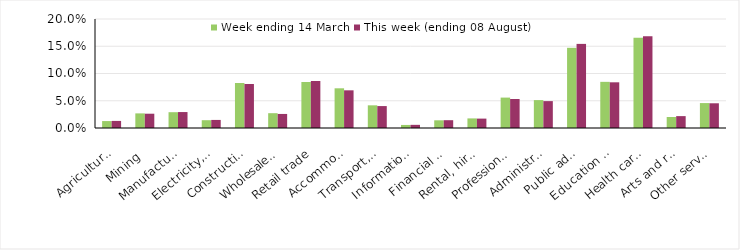
| Category | Week ending 14 March | This week (ending 08 August) |
|---|---|---|
| Agriculture, forestry and fishing | 0.013 | 0.013 |
| Mining | 0.027 | 0.026 |
| Manufacturing | 0.029 | 0.029 |
| Electricity, gas, water and waste services | 0.014 | 0.015 |
| Construction | 0.083 | 0.081 |
| Wholesale trade | 0.027 | 0.026 |
| Retail trade | 0.084 | 0.086 |
| Accommodation and food services | 0.073 | 0.069 |
| Transport, postal and warehousing | 0.042 | 0.04 |
| Information media and telecommunications | 0.006 | 0.006 |
| Financial and insurance services | 0.014 | 0.014 |
| Rental, hiring and real estate services | 0.018 | 0.017 |
| Professional, scientific and technical services | 0.056 | 0.053 |
| Administrative and support services | 0.051 | 0.049 |
| Public administration and safety | 0.147 | 0.154 |
| Education and training | 0.085 | 0.084 |
| Health care and social assistance | 0.165 | 0.168 |
| Arts and recreation services | 0.02 | 0.022 |
| Other services | 0.046 | 0.045 |